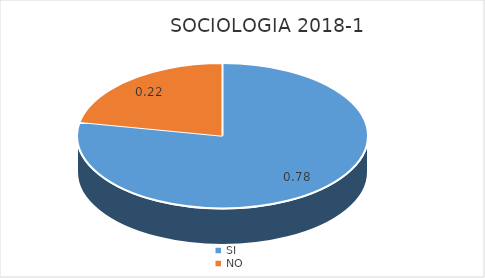
| Category | Series 0 |
|---|---|
| SI | 0.78 |
| NO | 0.22 |